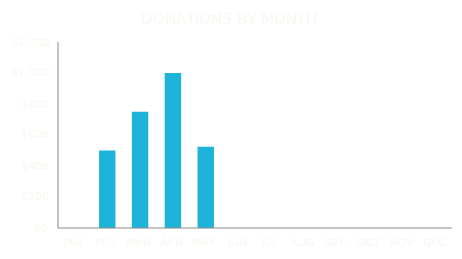
| Category | Donation |
|---|---|
| JAN | 0 |
| FEB | 500 |
| MAR | 750 |
| APR | 1000 |
| MAY | 525 |
| JUN | 0 |
| JUL | 0 |
| AUG | 0 |
| SEP | 0 |
| OCT | 0 |
| NOV | 0 |
| DEC | 0 |